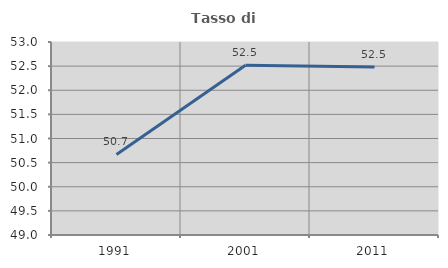
| Category | Tasso di occupazione   |
|---|---|
| 1991.0 | 50.67 |
| 2001.0 | 52.518 |
| 2011.0 | 52.48 |